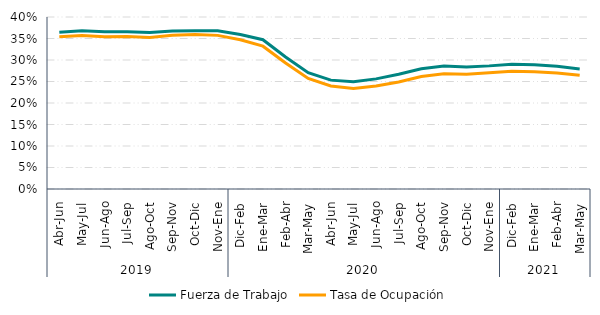
| Category | Fuerza de Trabajo | Tasa de Ocupación |
|---|---|---|
| 0 | 0.364 | 0.354 |
| 1 | 0.368 | 0.357 |
| 2 | 0.366 | 0.354 |
| 3 | 0.366 | 0.354 |
| 4 | 0.364 | 0.352 |
| 5 | 0.368 | 0.357 |
| 6 | 0.368 | 0.359 |
| 7 | 0.368 | 0.357 |
| 8 | 0.359 | 0.347 |
| 9 | 0.347 | 0.332 |
| 10 | 0.307 | 0.293 |
| 11 | 0.271 | 0.257 |
| 12 | 0.253 | 0.24 |
| 13 | 0.25 | 0.234 |
| 14 | 0.256 | 0.24 |
| 15 | 0.267 | 0.249 |
| 16 | 0.28 | 0.262 |
| 17 | 0.286 | 0.268 |
| 18 | 0.284 | 0.267 |
| 19 | 0.286 | 0.27 |
| 20 | 0.29 | 0.274 |
| 21 | 0.289 | 0.272 |
| 22 | 0.286 | 0.27 |
| 23 | 0.279 | 0.264 |